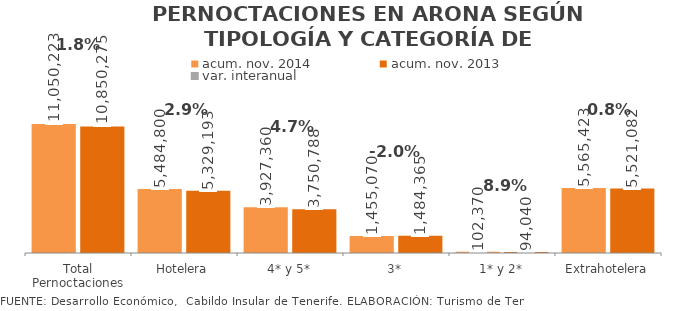
| Category | acum. nov. 2014 | acum. nov. 2013 |
|---|---|---|
| Total Pernoctaciones | 11050223 | 10850275 |
| Hotelera | 5484800 | 5329193 |
| 4* y 5* | 3927360 | 3750788 |
| 3* | 1455070 | 1484365 |
| 1* y 2* | 102370 | 94040 |
| Extrahotelera | 5565423 | 5521082 |